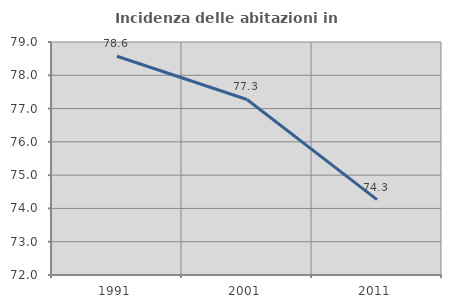
| Category | Incidenza delle abitazioni in proprietà  |
|---|---|
| 1991.0 | 78.571 |
| 2001.0 | 77.273 |
| 2011.0 | 74.265 |